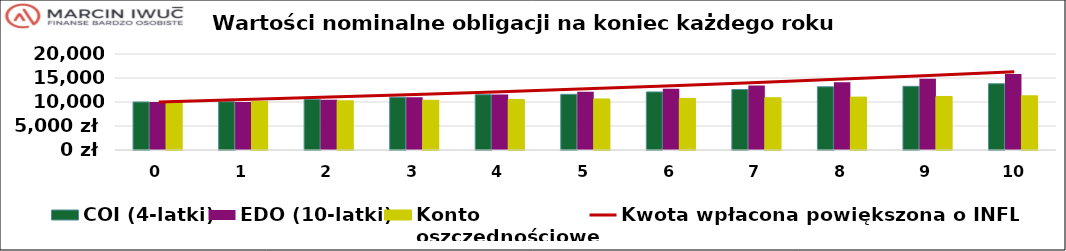
| Category | COI (4-latki) | EDO (10-latki) | Konto
oszczędnościowe |
|---|---|---|---|
| 0.0 | 10000 | 10000 | 10000 |
| 1.0 | 10048.6 | 10000 | 10122.179 |
| 2.0 | 10515.637 | 10469.962 | 10245.851 |
| 3.0 | 10988.379 | 10993.88 | 10371.033 |
| 4.0 | 11523.598 | 11549.233 | 10497.745 |
| 5.0 | 11598.397 | 12137.906 | 10626.006 |
| 6.0 | 12098.139 | 12761.901 | 10755.833 |
| 7.0 | 12603.988 | 13423.335 | 10887.247 |
| 8.0 | 13174.984 | 14124.455 | 11020.266 |
| 9.0 | 13267.421 | 14867.642 | 11154.91 |
| 10.0 | 13801.326 | 15817.421 | 11291.2 |